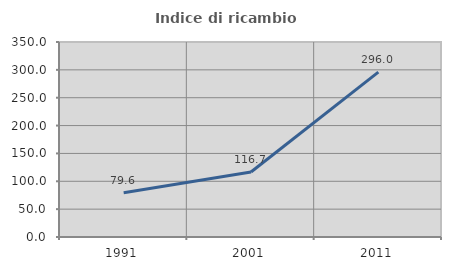
| Category | Indice di ricambio occupazionale  |
|---|---|
| 1991.0 | 79.608 |
| 2001.0 | 116.738 |
| 2011.0 | 296 |